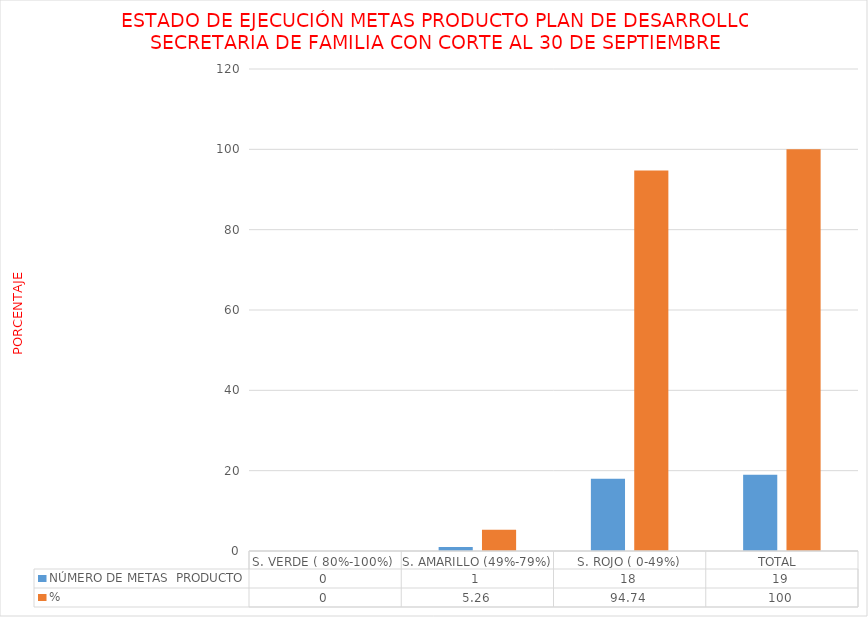
| Category | NÚMERO DE METAS  PRODUCTO  | % |
|---|---|---|
| S. VERDE ( 80%-100%)  | 0 | 0 |
| S. AMARILLO (49%-79%) | 1 | 5.263 |
| S. ROJO ( 0-49%) | 18 | 94.737 |
| TOTAL  | 19 | 100 |